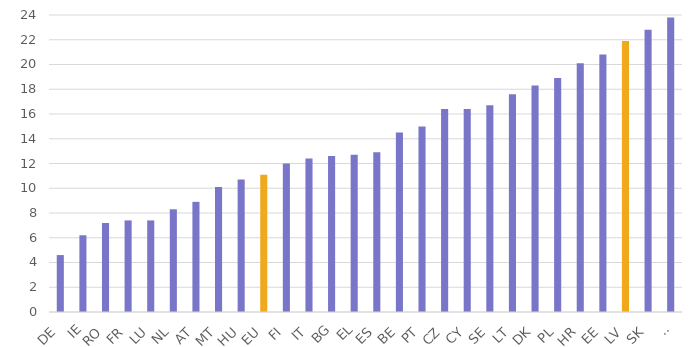
| Category | Series 0 |
|---|---|
| DE | 4.6 |
| IE | 6.2 |
| RO | 7.2 |
| FR | 7.4 |
| LU | 7.4 |
| NL | 8.3 |
| AT | 8.9 |
| MT | 10.1 |
| HU | 10.7 |
| EU | 11.1 |
| FI | 12 |
| IT | 12.4 |
| BG | 12.6 |
| EL | 12.7 |
| ES | 12.9 |
| BE | 14.5 |
| PT | 15 |
| CZ | 16.4 |
| CY | 16.4 |
| SE | 16.7 |
| LT | 17.6 |
| DK | 18.3 |
| PL | 18.9 |
| HR | 20.1 |
| EE | 20.8 |
| LV | 21.9 |
| SK | 22.8 |
| SI | 23.8 |